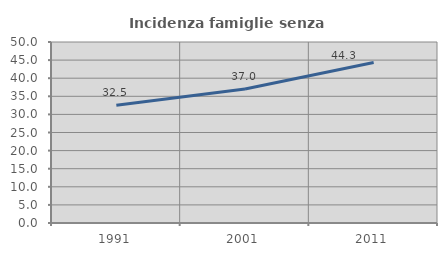
| Category | Incidenza famiglie senza nuclei |
|---|---|
| 1991.0 | 32.5 |
| 2001.0 | 37.008 |
| 2011.0 | 44.314 |